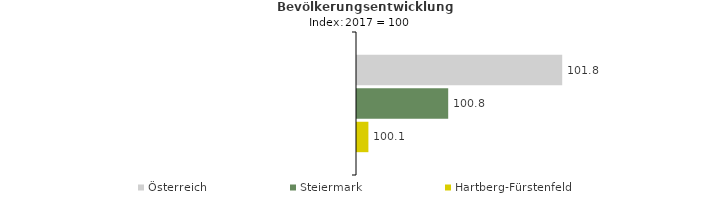
| Category | Österreich | Steiermark | Hartberg-Fürstenfeld |
|---|---|---|---|
| 2021.0 | 101.8 | 100.8 | 100.1 |